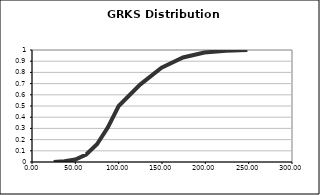
| Category | Series 0 |
|---|---|
| 25.0 | 0 |
| 37.5 | 0.006 |
| 50.0 | 0.023 |
| 62.5 | 0.067 |
| 75.0 | 0.159 |
| 87.5 | 0.309 |
| 100.0 | 0.5 |
| 124.75 | 0.691 |
| 149.5 | 0.841 |
| 174.25 | 0.933 |
| 199.0 | 0.977 |
| 223.75 | 0.994 |
| 248.5 | 1 |